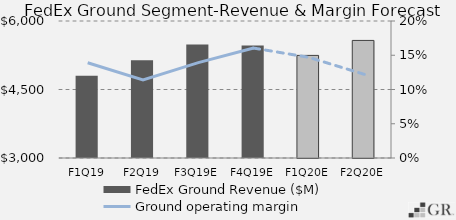
| Category | FedEx Ground Revenue ($M) |
|---|---|
|  F1Q19  | 4798.91 |
|  F2Q19  | 5141.812 |
|  F3Q19E  | 5485.452 |
|  F4Q19E  | 5464.111 |
|  F1Q20E  | 5246.655 |
|  F2Q20E  | 5574.383 |